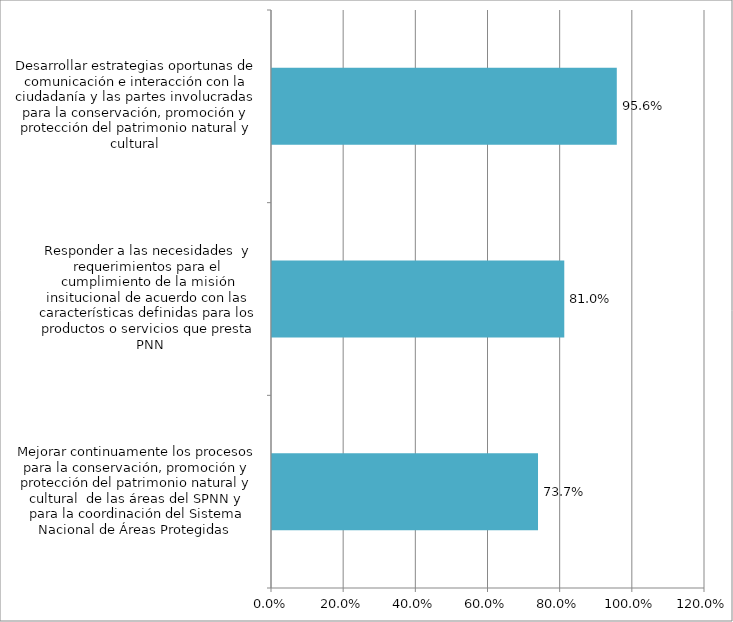
| Category | Series 0 |
|---|---|
| Mejorar continuamente los procesos para la conservación, promoción y protección del patrimonio natural y cultural  de las áreas del SPNN y para la coordinación del Sistema Nacional de Áreas Protegidas  | 0.737 |
| Responder a las necesidades  y requerimientos para el cumplimiento de la misión insitucional de acuerdo con las características definidas para los productos o servicios que presta PNN | 0.81 |
| Desarrollar estrategias oportunas de comunicación e interacción con la ciudadanía y las partes involucradas para la conservación, promoción y protección del patrimonio natural y cultural  | 0.956 |